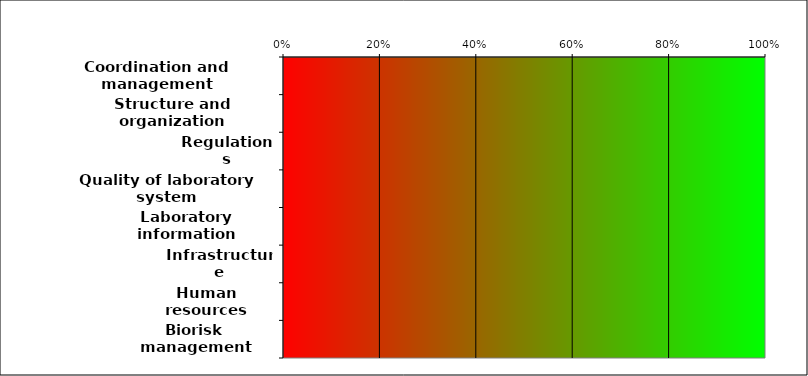
| Category | Series 7 |
|---|---|
| Coordination and management | 0 |
| Structure and organization | 0 |
| Regulations | 0 |
| Quality of laboratory system | 0 |
| Laboratory information management  | 0 |
| Infrastructure | 0 |
| Human resources | 0 |
| Biorisk management | 0 |